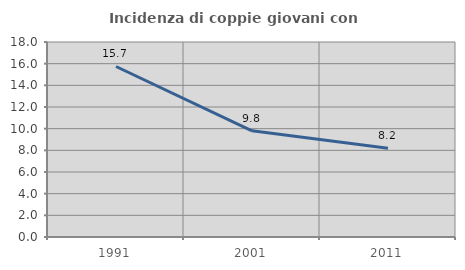
| Category | Incidenza di coppie giovani con figli |
|---|---|
| 1991.0 | 15.738 |
| 2001.0 | 9.801 |
| 2011.0 | 8.193 |